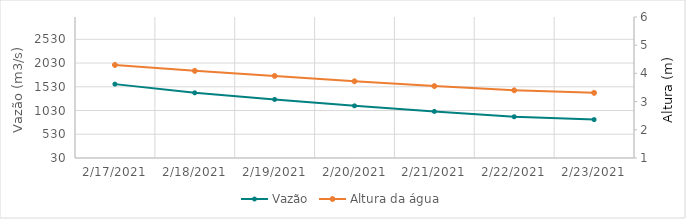
| Category | Vazão |
|---|---|
| 2/17/21 | 1606.4 |
| 2/16/21 | 1772.68 |
| 2/15/21 | 1925.48 |
| 2/14/21 | 2037.09 |
| 2/13/21 | 2053.99 |
| 2/12/21 | 2045.38 |
| 2/11/21 | 2077.58 |